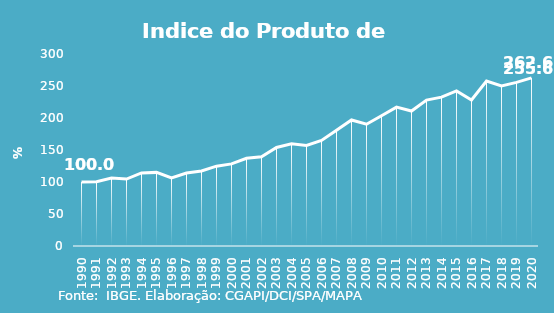
| Category | Indice de Prod. base 1990 |
|---|---|
| 1990.0 | 100 |
| 1991.0 | 100.275 |
| 1992.0 | 106.203 |
| 1993.0 | 104.57 |
| 1994.0 | 114.164 |
| 1995.0 | 115.024 |
| 1996.0 | 106.552 |
| 1997.0 | 114.037 |
| 1998.0 | 117.319 |
| 1999.0 | 124.734 |
| 2000.0 | 128.293 |
| 2001.0 | 136.975 |
| 2002.0 | 139.51 |
| 2003.0 | 153.868 |
| 2004.0 | 159.641 |
| 2005.0 | 157.136 |
| 2006.0 | 164.858 |
| 2007.0 | 180.781 |
| 2008.0 | 196.91 |
| 2009.0 | 190.309 |
| 2010.0 | 203.581 |
| 2011.0 | 217.041 |
| 2012.0 | 210.932 |
| 2013.0 | 228.009 |
| 2014.0 | 232.562 |
| 2015.0 | 242.318 |
| 2016.0 | 228.239 |
| 2017.0 | 257.766 |
| 2018.0 | 250.124 |
| 2019.0 | 255.64 |
| 2020.0 | 262.607 |